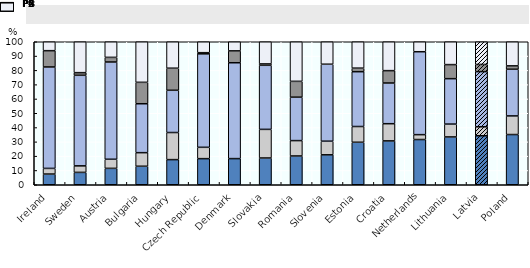
| Category | P2 | P3 | P4 | P5 | P6 |
|---|---|---|---|---|---|
| Ireland | 7.481 | 3.95 | 70.938 | 11.392 | 6.239 |
| Sweden | 8.653 | 4.565 | 63.325 | 1.853 | 21.604 |
| Austria | 11.469 | 6.357 | 68.022 | 3.231 | 10.921 |
| Bulgaria | 12.942 | 9.496 | 34.21 | 14.984 | 28.368 |
| Hungary | 17.574 | 18.949 | 29.541 | 15.446 | 18.49 |
| Czech Republic | 18.256 | 7.933 | 65.363 | 0.8 | 7.648 |
| Denmark | 18.282 | 0 | 67.043 | 8.297 | 6.377 |
| Slovakia | 18.71 | 20.015 | 44.814 | 0.96 | 15.501 |
| Romania | 20.126 | 10.746 | 30.376 | 11.074 | 27.677 |
| Slovenia | 20.925 | 9.536 | 53.827 | 0 | 15.712 |
| Estonia | 29.72 | 11.007 | 38.327 | 2.495 | 18.451 |
| Croatia | 30.668 | 12.03 | 28.455 | 8.653 | 20.195 |
| Netherlands | 31.63 | 3.411 | 57.979 | 0 | 6.98 |
| Lithuania | 33.441 | 8.984 | 31.765 | 9.83 | 15.979 |
| Latvia | 34.258 | 6.27 | 38.574 | 5.042 | 15.857 |
| Poland | 35.111 | 13.022 | 32.645 | 2.361 | 16.861 |